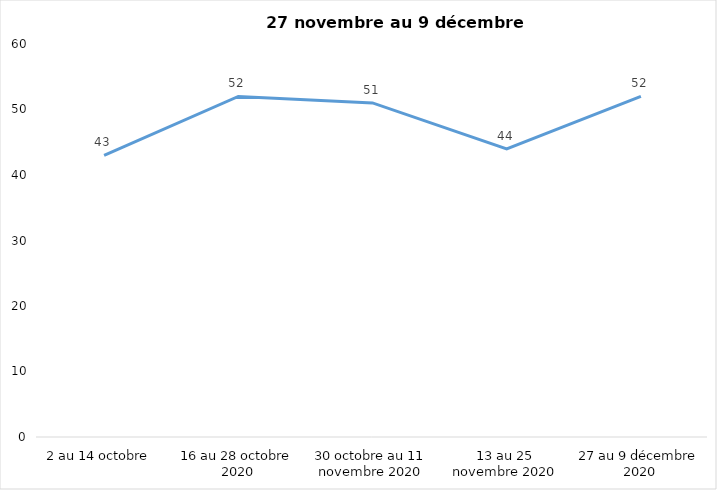
| Category | Series 0 |
|---|---|
| 2 au 14 octobre  | 43 |
| 16 au 28 octobre 2020 | 52 |
| 30 octobre au 11 novembre 2020 | 51 |
| 13 au 25 novembre 2020 | 44 |
| 27 au 9 décembre 2020 | 52 |